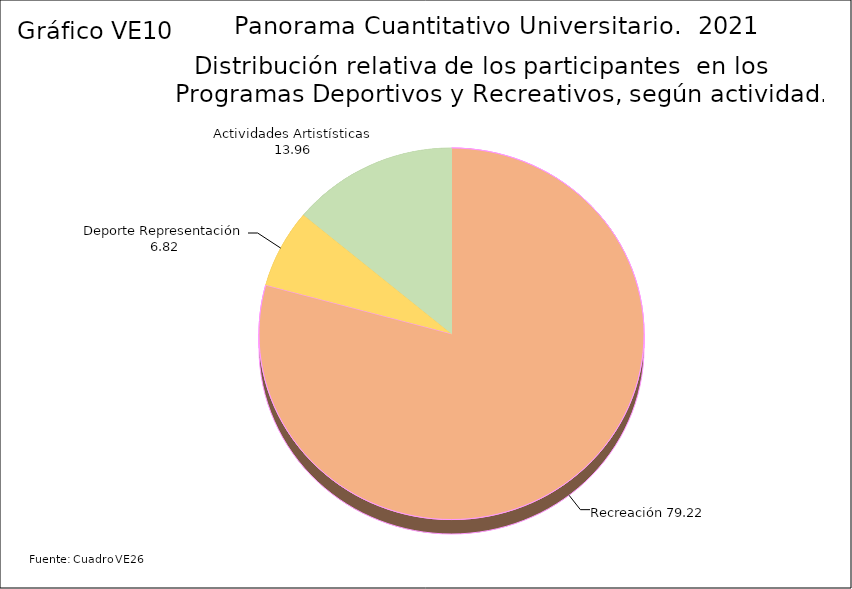
| Category | Series 3 |
|---|---|
| Recreación | 79.22 |
| Deporte Representación | 6.82 |
| Actividades Artistísticas | 13.96 |